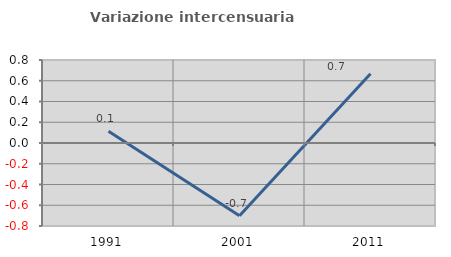
| Category | Variazione intercensuaria annua |
|---|---|
| 1991.0 | 0.114 |
| 2001.0 | -0.701 |
| 2011.0 | 0.668 |